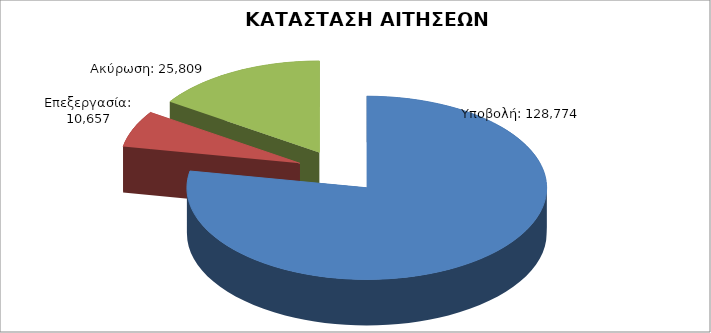
| Category | Series 0 |
|---|---|
| Υποβολή: | 128774 |
| Επεξεργασία: | 10657 |
| Ακύρωση: | 25809 |